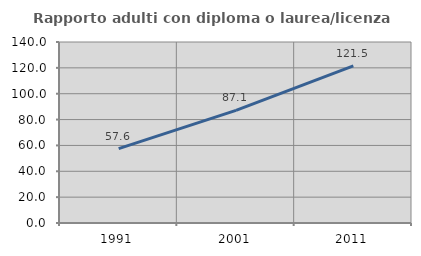
| Category | Rapporto adulti con diploma o laurea/licenza media  |
|---|---|
| 1991.0 | 57.559 |
| 2001.0 | 87.072 |
| 2011.0 | 121.481 |